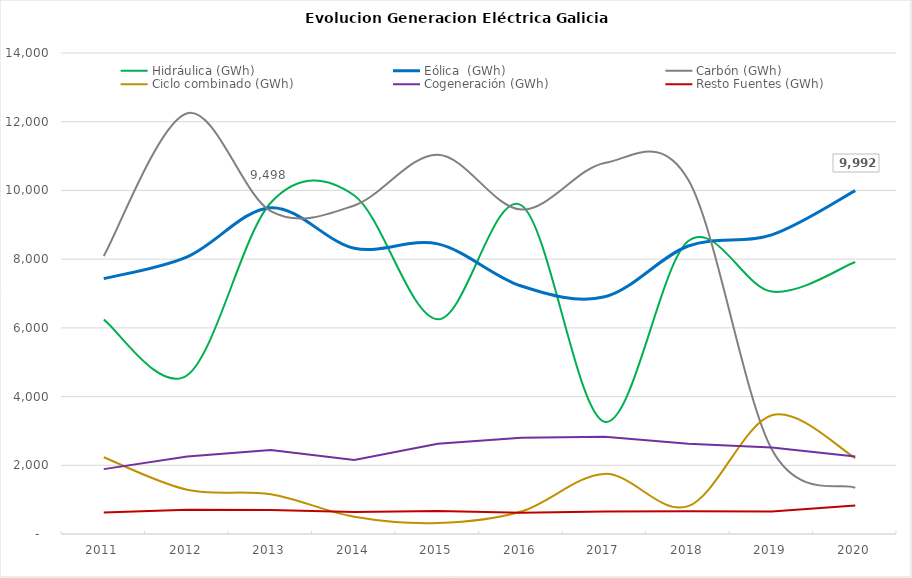
| Category | Hidráulica (GWh) | Eólica  (GWh) | Carbón (GWh) | Ciclo combinado (GWh) | Cogeneración (GWh) | Resto Fuentes (GWh) |
|---|---|---|---|---|---|---|
| 2011 | 6238.298 | 7432.879 | 8091.844 | 2233.892 | 1888.057 | 623.186 |
| 2012 | 4621.209 | 8068.619 | 12248.663 | 1287.269 | 2258.676 | 705.861 |
| 2013 | 9642.68 | 9497.931 | 9395.604 | 1154.598 | 2444.745 | 696.78 |
| 2014 | 9853.784 | 8316.47 | 9562.959 | 503.034 | 2151.936 | 641 |
| 2015 | 6249.44 | 8444.754 | 11040.91 | 319.281 | 2629.349 | 666.102 |
| 2016 | 9567.971 | 7218.889 | 9443.069 | 653.865 | 2801.992 | 617.612 |
| 2017 | 3263.526 | 6903.686 | 10799.685 | 1749.81 | 2831.012 | 653.371 |
| 2018 | 8525.807 | 8381.779 | 10307.836 | 809.917 | 2625.717 | 664.213 |
| 2019 | 7055.235 | 8706.769 | 2466.06 | 3455.501 | 2520.217 | 652.032 |
| 2020 | 7916.632 | 9992.311 | 1344.08 | 2212.326 | 2257.708 | 829.834 |